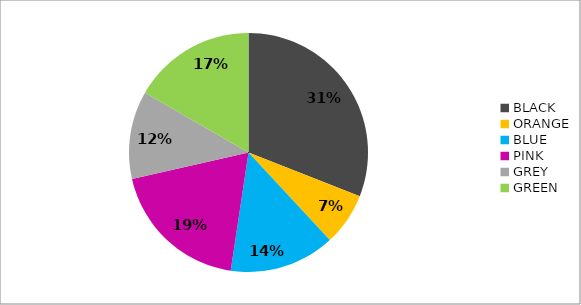
| Category | Series 0 |
|---|---|
| BLACK | 13 |
| ORANGE | 3 |
| BLUE | 6 |
| PINK | 8 |
| GREY | 5 |
| GREEN | 7 |